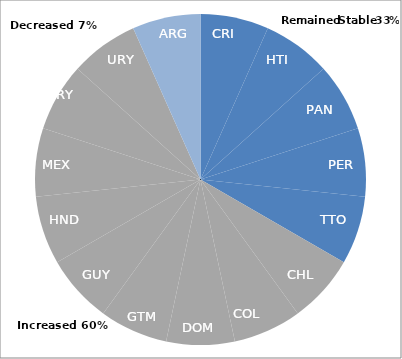
| Category | Variation in the number of cross-ministerial initiatives in recent years |
|---|---|
| CRI | 0.067 |
| HTI | 0.067 |
| PAN | 0.067 |
| PER | 0.067 |
| TTO | 0.067 |
| CHI | 0.067 |
| COL | 0.067 |
| DOM | 0.067 |
| GTM | 0.067 |
| GUY | 0.067 |
| HND | 0.067 |
| MEX | 0.067 |
| PRY | 0.067 |
| URY | 0.067 |
| ARG | 0.067 |